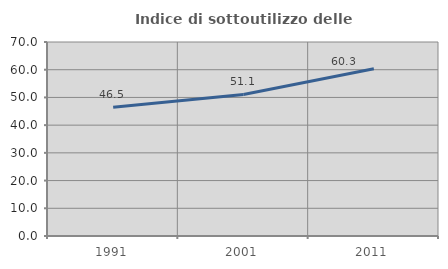
| Category | Indice di sottoutilizzo delle abitazioni  |
|---|---|
| 1991.0 | 46.494 |
| 2001.0 | 51.058 |
| 2011.0 | 60.322 |